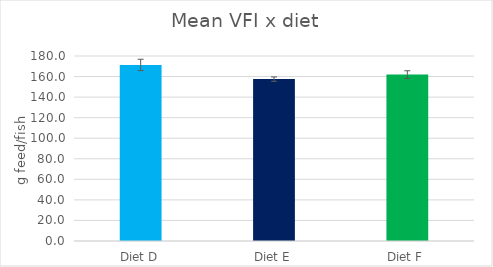
| Category | Mean VFI x diet |
|---|---|
| Diet D | 171.313 |
| Diet E | 157.5 |
| Diet F | 161.939 |